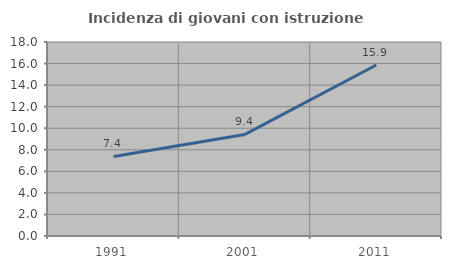
| Category | Incidenza di giovani con istruzione universitaria |
|---|---|
| 1991.0 | 7.384 |
| 2001.0 | 9.423 |
| 2011.0 | 15.869 |